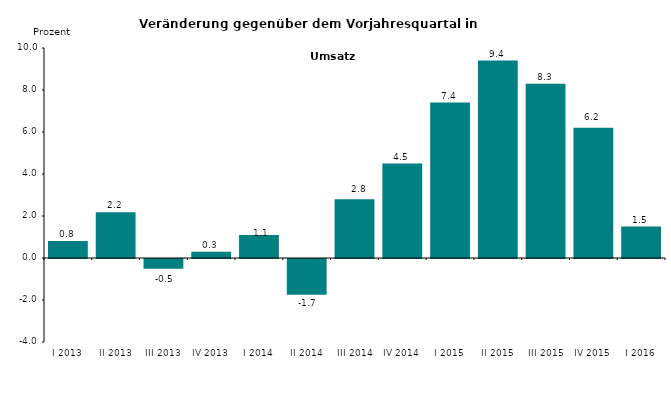
| Category | Series 0 |
|---|---|
| I 2013 | 0.81 |
| II 2013 | 2.181 |
| III 2013 | -0.465 |
| IV 2013 | 0.3 |
| I 2014 | 1.1 |
| II 2014 | -1.7 |
| III 2014 | 2.8 |
| IV 2014 | 4.5 |
| I 2015 | 7.4 |
| II 2015 | 9.4 |
| III 2015 | 8.3 |
| IV 2015 | 6.2 |
| I 2016 | 1.5 |